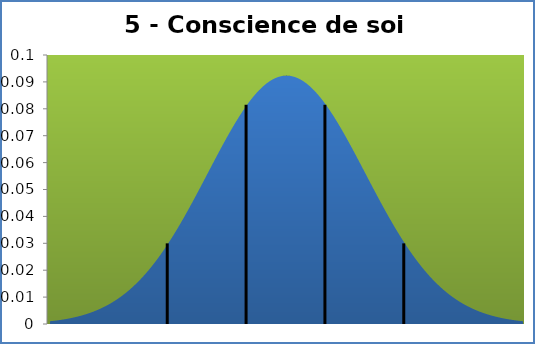
| Category | Series 1 |
|---|---|
| 2.599999999999998 | 0.001 |
| 2.815999999999999 | 0.001 |
| 3.032 | 0.001 |
| 3.2479999999999993 | 0.002 |
| 3.4640000000000004 | 0.002 |
| 3.6799999999999997 | 0.002 |
| 3.895999999999999 | 0.002 |
| 4.112 | 0.003 |
| 4.327999999999999 | 0.003 |
| 4.543999999999999 | 0.004 |
| 4.76 | 0.004 |
| 4.976000000000001 | 0.005 |
| 5.192 | 0.005 |
| 5.4079999999999995 | 0.006 |
| 5.623999999999999 | 0.007 |
| 5.84 | 0.007 |
| 6.055999999999999 | 0.008 |
| 6.272 | 0.009 |
| 6.488000000000001 | 0.01 |
| 6.704000000000001 | 0.011 |
| 6.92 | 0.012 |
| 7.135999999999999 | 0.014 |
| 7.3519999999999985 | 0.015 |
| 7.5680000000000005 | 0.017 |
| 7.784 | 0.018 |
| 8.0 | 0.02 |
| 8.216000000000001 | 0.022 |
| 8.432 | 0.024 |
| 8.648 | 0.026 |
| 8.864 | 0.028 |
| 9.079999999999998 | 0.03 |
| 9.296 | 0.032 |
| 9.512 | 0.035 |
| 9.728 | 0.037 |
| 9.943999999999999 | 0.04 |
| 10.16 | 0.042 |
| 10.376000000000001 | 0.045 |
| 10.591999999999999 | 0.048 |
| 10.808 | 0.05 |
| 11.024000000000001 | 0.053 |
| 11.24 | 0.056 |
| 11.456 | 0.059 |
| 11.672 | 0.062 |
| 11.888000000000002 | 0.064 |
| 12.104 | 0.067 |
| 12.32 | 0.07 |
| 12.536000000000001 | 0.072 |
| 12.752 | 0.075 |
| 12.968 | 0.077 |
| 13.184000000000001 | 0.079 |
| 13.4 | 0.081 |
| 13.616 | 0.083 |
| 13.832 | 0.085 |
| 14.048 | 0.087 |
| 14.264000000000001 | 0.088 |
| 14.48 | 0.09 |
| 14.696 | 0.091 |
| 14.912 | 0.091 |
| 15.128 | 0.092 |
| 15.344000000000001 | 0.092 |
| 15.56 | 0.092 |
| 15.776 | 0.092 |
| 15.992 | 0.092 |
| 16.208000000000002 | 0.091 |
| 16.424 | 0.091 |
| 16.64 | 0.09 |
| 16.856 | 0.088 |
| 17.072 | 0.087 |
| 17.288 | 0.085 |
| 17.504 | 0.083 |
| 17.72 | 0.081 |
| 17.936 | 0.079 |
| 18.152 | 0.077 |
| 18.368000000000002 | 0.075 |
| 18.584 | 0.072 |
| 18.8 | 0.07 |
| 19.016000000000002 | 0.067 |
| 19.232 | 0.064 |
| 19.448 | 0.062 |
| 19.664 | 0.059 |
| 19.880000000000003 | 0.056 |
| 20.096 | 0.053 |
| 20.312 | 0.05 |
| 20.528000000000002 | 0.048 |
| 20.744 | 0.045 |
| 20.96 | 0.042 |
| 21.176000000000002 | 0.04 |
| 21.392000000000003 | 0.037 |
| 21.608 | 0.035 |
| 21.824 | 0.032 |
| 22.040000000000003 | 0.03 |
| 22.256 | 0.028 |
| 22.472 | 0.026 |
| 22.688000000000002 | 0.024 |
| 22.904 | 0.022 |
| 23.12 | 0.02 |
| 23.336000000000002 | 0.018 |
| 23.552 | 0.017 |
| 23.768 | 0.015 |
| 23.984 | 0.014 |
| 24.200000000000003 | 0.012 |
| 24.416 | 0.011 |
| 24.631999999999998 | 0.01 |
| 24.848 | 0.009 |
| 25.064 | 0.008 |
| 25.28 | 0.007 |
| 25.496000000000002 | 0.007 |
| 25.712000000000003 | 0.006 |
| 25.928 | 0.005 |
| 26.144 | 0.005 |
| 26.36 | 0.004 |
| 26.576 | 0.004 |
| 26.792 | 0.003 |
| 27.008000000000003 | 0.003 |
| 27.224000000000004 | 0.002 |
| 27.44 | 0.002 |
| 27.656 | 0.002 |
| 27.872 | 0.002 |
| 28.088 | 0.001 |
| 28.304000000000002 | 0.001 |
| 28.520000000000003 | 0.001 |